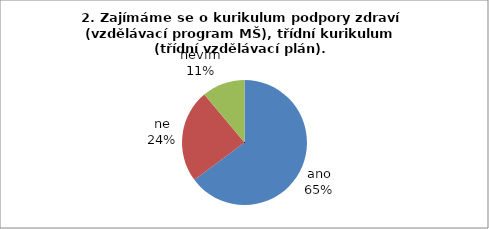
| Category | 2. |
|---|---|
| ano | 35 |
| ne | 13 |
| nevím | 6 |